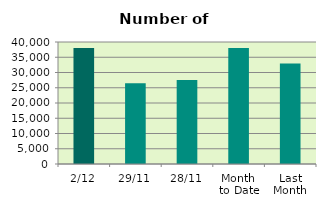
| Category | Series 0 |
|---|---|
| 2/12 | 38010 |
| 29/11 | 26508 |
| 28/11 | 27574 |
| Month 
to Date | 38010 |
| Last
Month | 32932.667 |